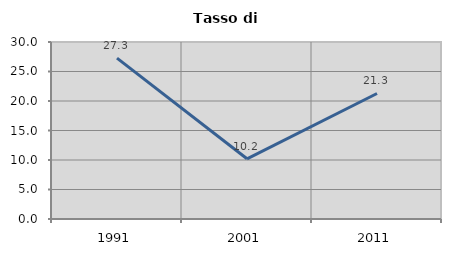
| Category | Tasso di disoccupazione   |
|---|---|
| 1991.0 | 27.273 |
| 2001.0 | 10.204 |
| 2011.0 | 21.277 |